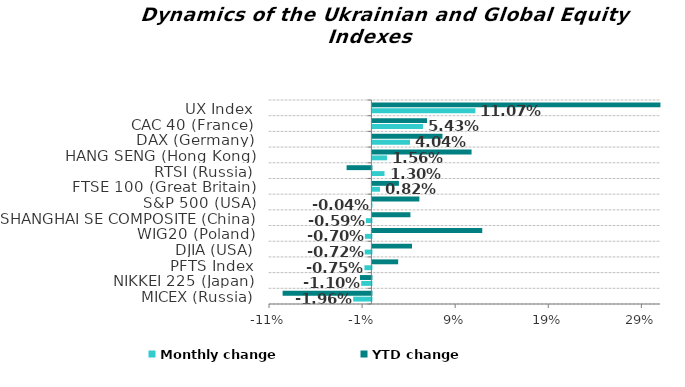
| Category | Monthly change | YTD change |
|---|---|---|
| MICEX (Russia) | -0.02 | -0.095 |
| NIKKEI 225 (Japan) | -0.011 | -0.012 |
| PFTS Index | -0.008 | 0.028 |
| DJIA (USA) | -0.007 | 0.043 |
| WIG20 (Poland) | -0.007 | 0.118 |
| SHANGHAI SE COMPOSITE (China) | -0.006 | 0.041 |
| S&P 500 (USA) | 0 | 0.05 |
| FTSE 100 (Great Britain) | 0.008 | 0.028 |
| RTSI (Russia) | 0.013 | -0.027 |
| HANG SENG (Hong Kong) | 0.016 | 0.106 |
| DAX (Germany) | 0.04 | 0.075 |
| CAC 40 (France) | 0.054 | 0.059 |
| UX Index | 0.111 | 0.309 |